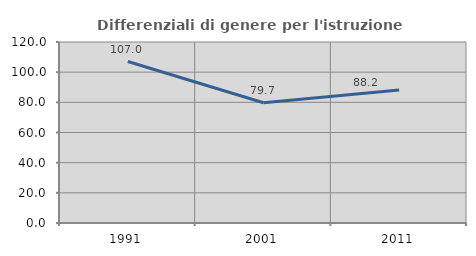
| Category | Differenziali di genere per l'istruzione superiore |
|---|---|
| 1991.0 | 107.048 |
| 2001.0 | 79.709 |
| 2011.0 | 88.225 |